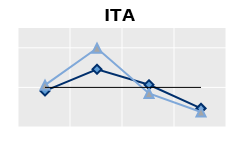
| Category | Né à l'étranger | Né dans le pays | Series 1 |
|---|---|---|---|
| 15-24 | 0.911 | 1.057 | 1 |
| 25-54 | 1.457 | 1.987 | 1 |
| 55-64 | 1.065 | 0.848 | 1 |
| 65+ | 0.47 | 0.38 | 1 |